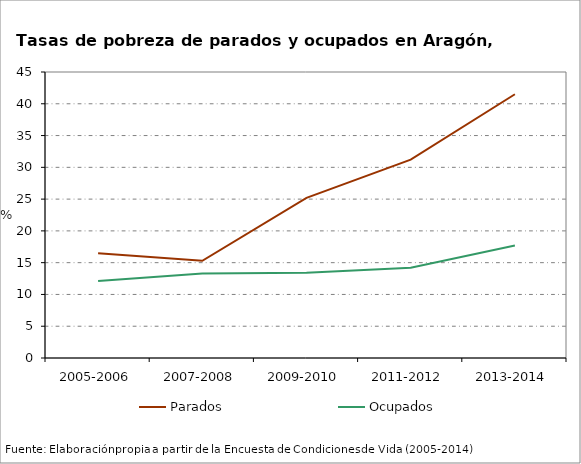
| Category | Parados | Ocupados |
|---|---|---|
| 2005-2006 | 16.5 | 12.1 |
| 2007-2008 | 15.3 | 13.3 |
| 2009-2010 | 25.2 | 13.4 |
| 2011-2012 | 31.2 | 14.2 |
| 2013-2014 | 41.5 | 17.7 |